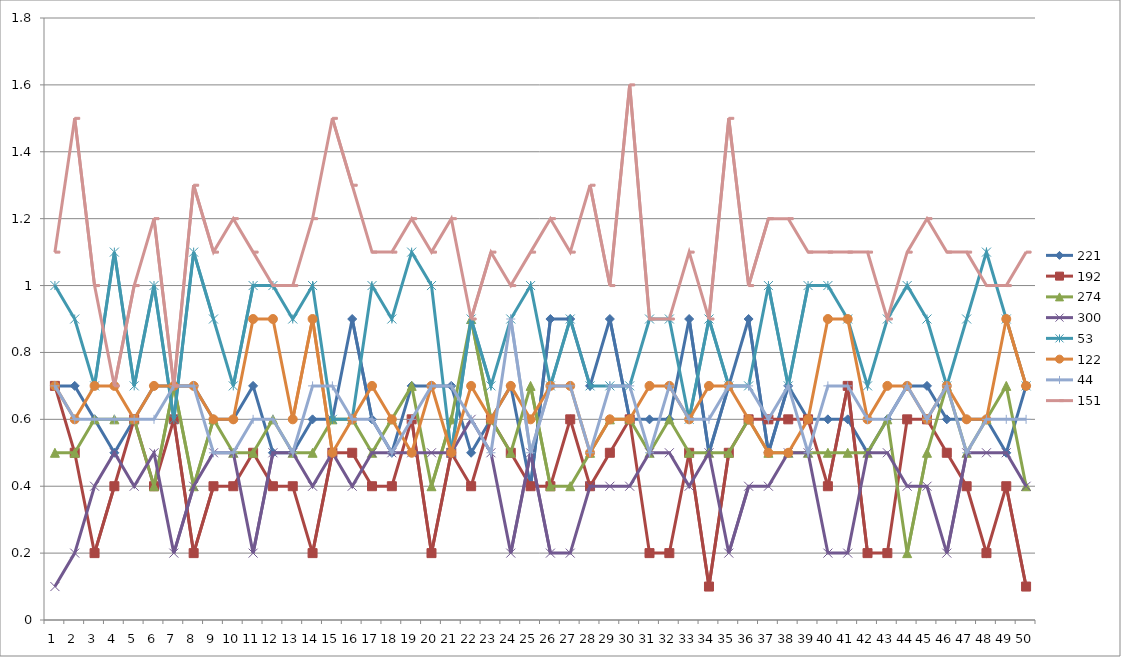
| Category | 221 | 192 | 274 | 300 | 53 | 122 | 44 | 151 |
|---|---|---|---|---|---|---|---|---|
| 0 | 0.7 | 0.7 | 0.5 | 0.1 | 1 | 0.7 | 0.7 | 1.1 |
| 1 | 0.7 | 0.5 | 0.5 | 0.2 | 0.9 | 0.6 | 0.6 | 1.5 |
| 2 | 0.6 | 0.2 | 0.6 | 0.4 | 0.7 | 0.7 | 0.6 | 1 |
| 3 | 0.5 | 0.4 | 0.6 | 0.5 | 1.1 | 0.7 | 0.6 | 0.7 |
| 4 | 0.6 | 0.6 | 0.6 | 0.4 | 0.7 | 0.6 | 0.6 | 1 |
| 5 | 0.7 | 0.4 | 0.4 | 0.5 | 1 | 0.7 | 0.6 | 1.2 |
| 6 | 0.7 | 0.6 | 0.7 | 0.2 | 0.6 | 0.7 | 0.7 | 0.7 |
| 7 | 0.7 | 0.2 | 0.4 | 0.4 | 1.1 | 0.7 | 0.7 | 1.3 |
| 8 | 0.6 | 0.4 | 0.6 | 0.5 | 0.9 | 0.6 | 0.5 | 1.1 |
| 9 | 0.6 | 0.4 | 0.5 | 0.5 | 0.7 | 0.6 | 0.5 | 1.2 |
| 10 | 0.7 | 0.5 | 0.5 | 0.2 | 1 | 0.9 | 0.6 | 1.1 |
| 11 | 0.5 | 0.4 | 0.6 | 0.5 | 1 | 0.9 | 0.6 | 1 |
| 12 | 0.5 | 0.4 | 0.5 | 0.5 | 0.9 | 0.6 | 0.5 | 1 |
| 13 | 0.6 | 0.2 | 0.5 | 0.4 | 1 | 0.9 | 0.7 | 1.2 |
| 14 | 0.6 | 0.5 | 0.6 | 0.5 | 0.6 | 0.5 | 0.7 | 1.5 |
| 15 | 0.9 | 0.5 | 0.6 | 0.4 | 0.6 | 0.6 | 0.6 | 1.3 |
| 16 | 0.6 | 0.4 | 0.5 | 0.5 | 1 | 0.7 | 0.6 | 1.1 |
| 17 | 0.5 | 0.4 | 0.6 | 0.5 | 0.9 | 0.6 | 0.5 | 1.1 |
| 18 | 0.7 | 0.6 | 0.7 | 0.5 | 1.1 | 0.5 | 0.6 | 1.2 |
| 19 | 0.7 | 0.2 | 0.4 | 0.5 | 1 | 0.7 | 0.7 | 1.1 |
| 20 | 0.7 | 0.5 | 0.6 | 0.5 | 0.5 | 0.5 | 0.7 | 1.2 |
| 21 | 0.5 | 0.4 | 0.9 | 0.6 | 0.9 | 0.7 | 0.6 | 0.9 |
| 22 | 0.6 | 0.6 | 0.6 | 0.5 | 0.7 | 0.6 | 0.5 | 1.1 |
| 23 | 0.7 | 0.5 | 0.5 | 0.2 | 0.9 | 0.7 | 0.9 | 1 |
| 24 | 0.4 | 0.4 | 0.7 | 0.5 | 1 | 0.6 | 0.5 | 1.1 |
| 25 | 0.9 | 0.4 | 0.4 | 0.2 | 0.7 | 0.7 | 0.7 | 1.2 |
| 26 | 0.9 | 0.6 | 0.4 | 0.2 | 0.9 | 0.7 | 0.7 | 1.1 |
| 27 | 0.7 | 0.4 | 0.5 | 0.4 | 0.7 | 0.5 | 0.5 | 1.3 |
| 28 | 0.9 | 0.5 | 0.6 | 0.4 | 0.7 | 0.6 | 0.7 | 1 |
| 29 | 0.6 | 0.6 | 0.6 | 0.4 | 0.7 | 0.6 | 0.7 | 1.6 |
| 30 | 0.6 | 0.2 | 0.5 | 0.5 | 0.9 | 0.7 | 0.5 | 0.9 |
| 31 | 0.6 | 0.2 | 0.6 | 0.5 | 0.9 | 0.7 | 0.7 | 0.9 |
| 32 | 0.9 | 0.5 | 0.5 | 0.4 | 0.6 | 0.6 | 0.6 | 1.1 |
| 33 | 0.5 | 0.1 | 0.5 | 0.5 | 0.9 | 0.7 | 0.6 | 0.9 |
| 34 | 0.7 | 0.5 | 0.5 | 0.2 | 0.7 | 0.7 | 0.7 | 1.5 |
| 35 | 0.9 | 0.6 | 0.6 | 0.4 | 0.7 | 0.6 | 0.7 | 1 |
| 36 | 0.5 | 0.6 | 0.5 | 0.4 | 1 | 0.5 | 0.6 | 1.2 |
| 37 | 0.7 | 0.6 | 0.5 | 0.5 | 0.7 | 0.5 | 0.7 | 1.2 |
| 38 | 0.6 | 0.6 | 0.5 | 0.5 | 1 | 0.6 | 0.5 | 1.1 |
| 39 | 0.6 | 0.4 | 0.5 | 0.2 | 1 | 0.9 | 0.7 | 1.1 |
| 40 | 0.6 | 0.7 | 0.5 | 0.2 | 0.9 | 0.9 | 0.7 | 1.1 |
| 41 | 0.5 | 0.2 | 0.5 | 0.5 | 0.7 | 0.6 | 0.6 | 1.1 |
| 42 | 0.6 | 0.2 | 0.6 | 0.5 | 0.9 | 0.7 | 0.6 | 0.9 |
| 43 | 0.7 | 0.6 | 0.2 | 0.4 | 1 | 0.7 | 0.7 | 1.1 |
| 44 | 0.7 | 0.6 | 0.5 | 0.4 | 0.9 | 0.6 | 0.6 | 1.2 |
| 45 | 0.6 | 0.5 | 0.7 | 0.2 | 0.7 | 0.7 | 0.7 | 1.1 |
| 46 | 0.6 | 0.4 | 0.5 | 0.5 | 0.9 | 0.6 | 0.5 | 1.1 |
| 47 | 0.6 | 0.2 | 0.6 | 0.5 | 1.1 | 0.6 | 0.6 | 1 |
| 48 | 0.5 | 0.4 | 0.7 | 0.5 | 0.9 | 0.9 | 0.6 | 1 |
| 49 | 0.7 | 0.1 | 0.4 | 0.4 | 0.7 | 0.7 | 0.6 | 1.1 |